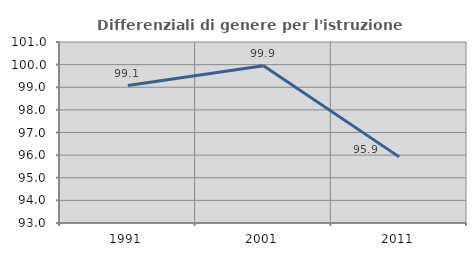
| Category | Differenziali di genere per l'istruzione superiore |
|---|---|
| 1991.0 | 99.073 |
| 2001.0 | 99.946 |
| 2011.0 | 95.923 |